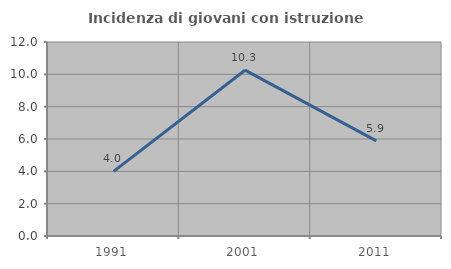
| Category | Incidenza di giovani con istruzione universitaria |
|---|---|
| 1991.0 | 4 |
| 2001.0 | 10.256 |
| 2011.0 | 5.882 |